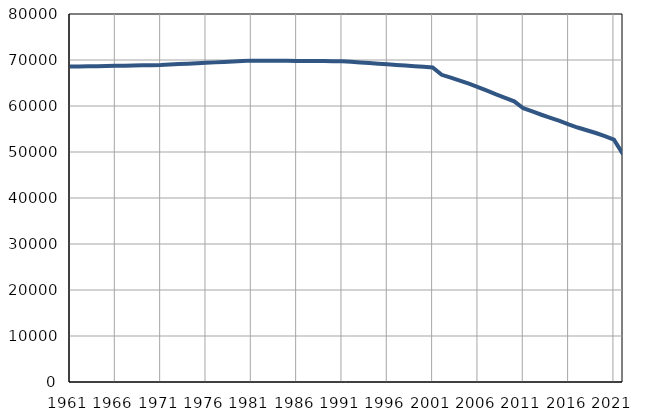
| Category | Број
становника |
|---|---|
| 1961.0 | 68562 |
| 1962.0 | 68596 |
| 1963.0 | 68633 |
| 1964.0 | 68668 |
| 1965.0 | 68703 |
| 1966.0 | 68738 |
| 1967.0 | 68774 |
| 1968.0 | 68808 |
| 1969.0 | 68844 |
| 1970.0 | 68880 |
| 1971.0 | 68915 |
| 1972.0 | 69010 |
| 1973.0 | 69105 |
| 1974.0 | 69200 |
| 1975.0 | 69295 |
| 1976.0 | 69390 |
| 1977.0 | 69484 |
| 1978.0 | 69580 |
| 1979.0 | 69674 |
| 1980.0 | 69769 |
| 1981.0 | 69864 |
| 1982.0 | 69851 |
| 1983.0 | 69840 |
| 1984.0 | 69828 |
| 1985.0 | 69816 |
| 1986.0 | 69804 |
| 1987.0 | 69791 |
| 1988.0 | 69779 |
| 1989.0 | 69767 |
| 1990.0 | 69755 |
| 1991.0 | 69743 |
| 1992.0 | 69608 |
| 1993.0 | 69473 |
| 1994.0 | 69338 |
| 1995.0 | 69203 |
| 1996.0 | 69068 |
| 1997.0 | 68933 |
| 1998.0 | 68798 |
| 1999.0 | 68663 |
| 2000.0 | 68528 |
| 2001.0 | 68393 |
| 2002.0 | 66781 |
| 2003.0 | 66168 |
| 2004.0 | 65532 |
| 2005.0 | 64842 |
| 2006.0 | 64119 |
| 2007.0 | 63324 |
| 2008.0 | 62530 |
| 2009.0 | 61790 |
| 2010.0 | 61007 |
| 2011.0 | 59511 |
| 2012.0 | 58824 |
| 2013.0 | 58099 |
| 2014.0 | 57424 |
| 2015.0 | 56760 |
| 2016.0 | 55998 |
| 2017.0 | 55318 |
| 2018.0 | 54729 |
| 2019.0 | 54131 |
| 2020.0 | 53453 |
| 2021.0 | 52668 |
| 2022.0 | 49541 |